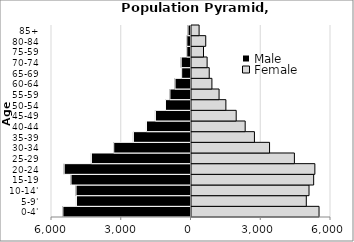
| Category | Male | Female |
|---|---|---|
| 0-4' | -5510.09 | 5485.75 |
| 5-9' | -4926.93 | 4937.61 |
| 10-14' | -4944.14 | 5054.75 |
| 15-19 | -5161.17 | 5254.24 |
| 20-24 | -5454.33 | 5306.29 |
| 25-29 | -4282.98 | 4425.45 |
| 30-34 | -3323.38 | 3357.48 |
| 35-39 | -2476.86 | 2706.49 |
| 40-44 | -1915.26 | 2309.12 |
| 45-49 | -1529.61 | 1922.1 |
| 50-54 | -1097.55 | 1479.16 |
| 55-59 | -905.92 | 1186.13 |
| 60-64 | -686.34 | 878.01 |
| 65-69 | -402.36 | 762.49 |
| 70-74 | -421.09 | 671.91 |
| 75-59 | -182.09 | 516.38 |
| 80-84 | -180.26 | 612.89 |
| 85+ | -128.33 | 327.12 |